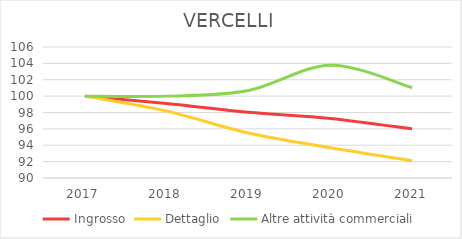
| Category | Ingrosso | Dettaglio | Altre attività commerciali |
|---|---|---|---|
| 2017.0 | 100 | 100 | 100 |
| 2018.0 | 99.092 | 98.165 | 100 |
| 2019.0 | 98.032 | 95.493 | 100.687 |
| 2020.0 | 97.275 | 93.69 | 103.78 |
| 2021.0 | 95.988 | 92.112 | 101.031 |